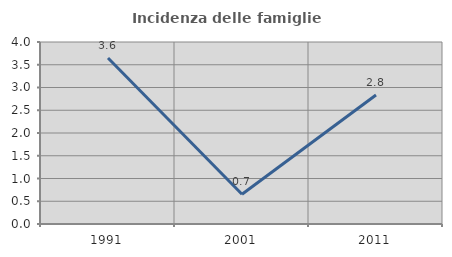
| Category | Incidenza delle famiglie numerose |
|---|---|
| 1991.0 | 3.65 |
| 2001.0 | 0.654 |
| 2011.0 | 2.837 |